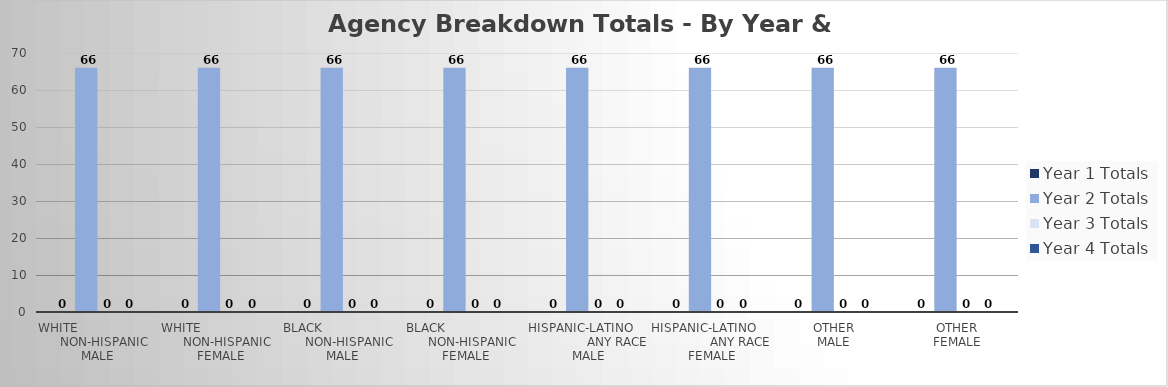
| Category | Year 1 Totals | Year 2 Totals | Year 3 Totals | Year 4 Totals |
|---|---|---|---|---|
| White                         Non-Hispanic
MALE | 0 | 66 | 0 | 0 |
| White                         Non-Hispanic
FEMALE | 0 | 66 | 0 | 0 |
| Black                         Non-Hispanic
MALE | 0 | 66 | 0 | 0 |
| Black                         Non-Hispanic
FEMALE | 0 | 66 | 0 | 0 |
| Hispanic-Latino                   any Race
MALE | 0 | 66 | 0 | 0 |
| Hispanic-Latino                   any Race
FEMALE | 0 | 66 | 0 | 0 |
| Other
MALE | 0 | 66 | 0 | 0 |
| Other
FEMALE | 0 | 66 | 0 | 0 |